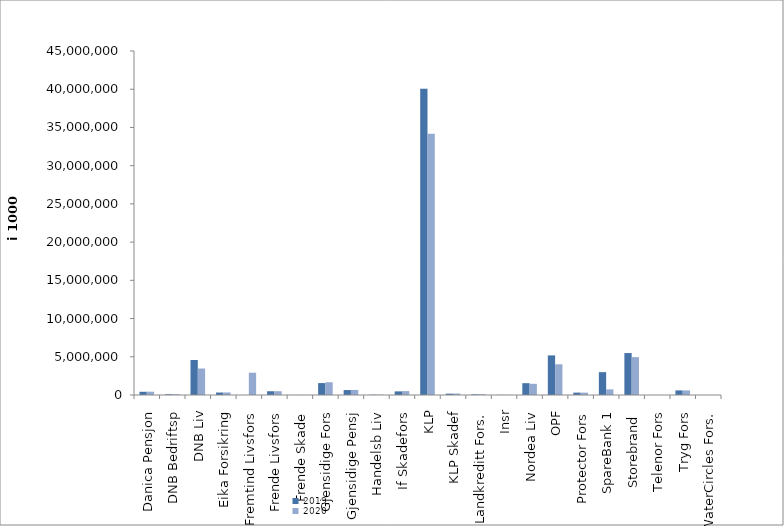
| Category | 2019 | 2020 |
|---|---|---|
| Danica Pensjon | 421442.946 | 430556.189 |
| DNB Bedriftsp | 96824 | 98726 |
| DNB Liv | 4578461 | 3463853.922 |
| Eika Forsikring | 323640 | 335372 |
| Fremtind Livsfors | 0 | 2912282.942 |
| Frende Livsfors | 490047 | 496774 |
| Frende Skade | 8197 | 6351.564 |
| Gjensidige Fors | 1559670 | 1666418 |
| Gjensidige Pensj | 648034 | 662338 |
| Handelsb Liv | 35020.773 | 34452.758 |
| If Skadefors | 472830.559 | 508488.738 |
| KLP | 40071235.121 | 34177241.88 |
| KLP Skadef | 175357 | 194718 |
| Landkreditt Fors. | 83630 | 98068 |
| Insr | 17501.088 | 14663 |
| Nordea Liv | 1547946.083 | 1464010.08 |
| OPF | 5181000 | 4017000 |
| Protector Fors | 312787.175 | 307752.039 |
| SpareBank 1 | 2988164.167 | 735170.289 |
| Storebrand  | 5485806.5 | 4956525.376 |
| Telenor Fors | 1989 | 1726 |
| Tryg Fors | 601419.671 | 598971.115 |
| WaterCircles Fors. | 0 | 1278 |